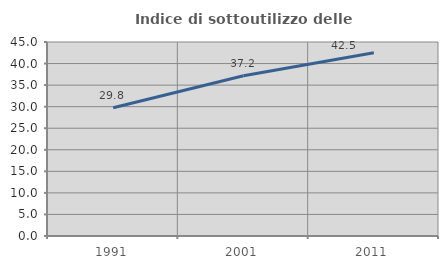
| Category | Indice di sottoutilizzo delle abitazioni  |
|---|---|
| 1991.0 | 29.756 |
| 2001.0 | 37.169 |
| 2011.0 | 42.49 |